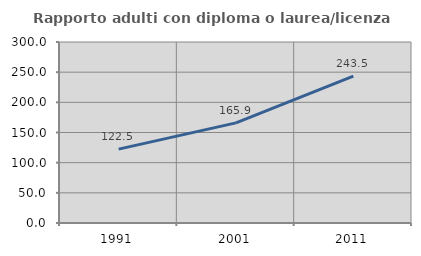
| Category | Rapporto adulti con diploma o laurea/licenza media  |
|---|---|
| 1991.0 | 122.469 |
| 2001.0 | 165.925 |
| 2011.0 | 243.483 |